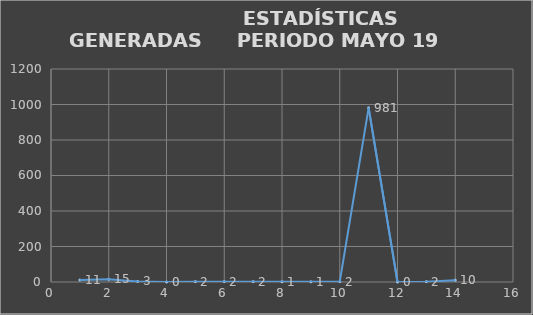
| Category |                   ESTADÍSTICAS GENERADAS  |
|---|---|
| 0 | 11 |
| 1 | 15 |
| 2 | 3 |
| 3 | 0 |
| 4 | 2 |
| 5 | 2 |
| 6 | 2 |
| 7 | 1 |
| 8 | 1 |
| 9 | 2 |
| 10 | 981 |
| 11 | 0 |
| 12 | 2 |
| 13 | 10 |